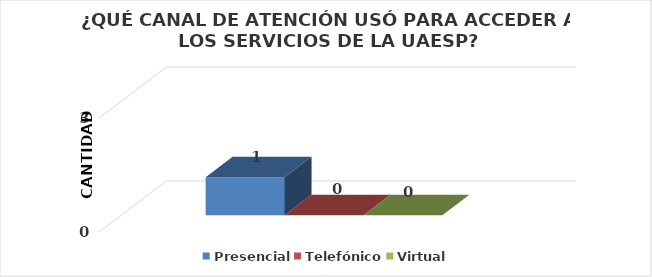
| Category | Presencial | Telefónico | Virtual |
|---|---|---|---|
| 0 | 1 | 0 | 0 |